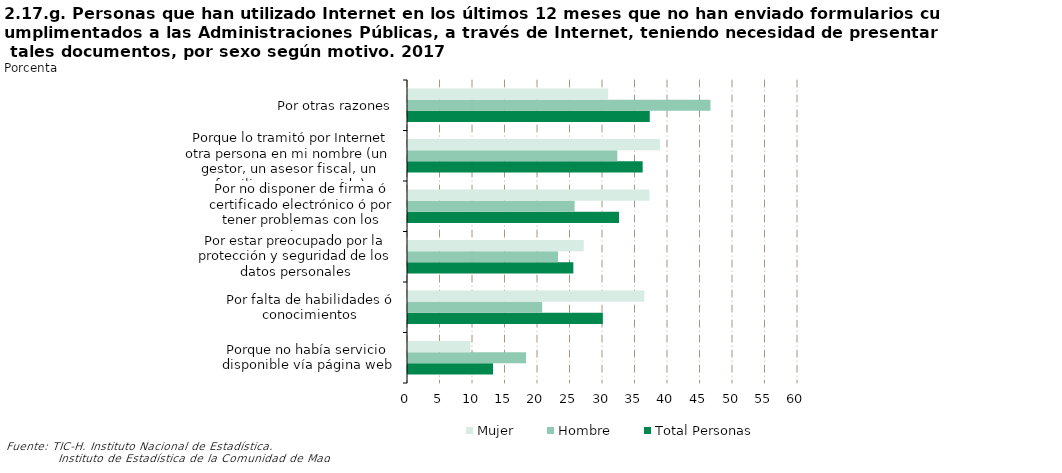
| Category | Total Personas | Hombre | Mujer |
|---|---|---|---|
| Porque no había servicio disponible vía página web | 13.08 | 18.16 | 9.604 |
| Por falta de habilidades ó conocimientos | 29.979 | 20.643 | 36.367 |
| Por estar preocupado por la protección y seguridad de los datos personales | 25.438 | 23.091 | 27.044 |
| Por no disponer de firma ó certificado electrónico ó por tener problemas con los mismos | 32.467 | 25.633 | 37.144 |
| Porque lo tramitó por Internet otra persona en mi nombre (un  gestor, un asesor fiscal, un familiar o un conocido) | 36.104 | 32.202 | 38.774 |
| Por otras razones | 37.191 | 46.538 | 30.794 |